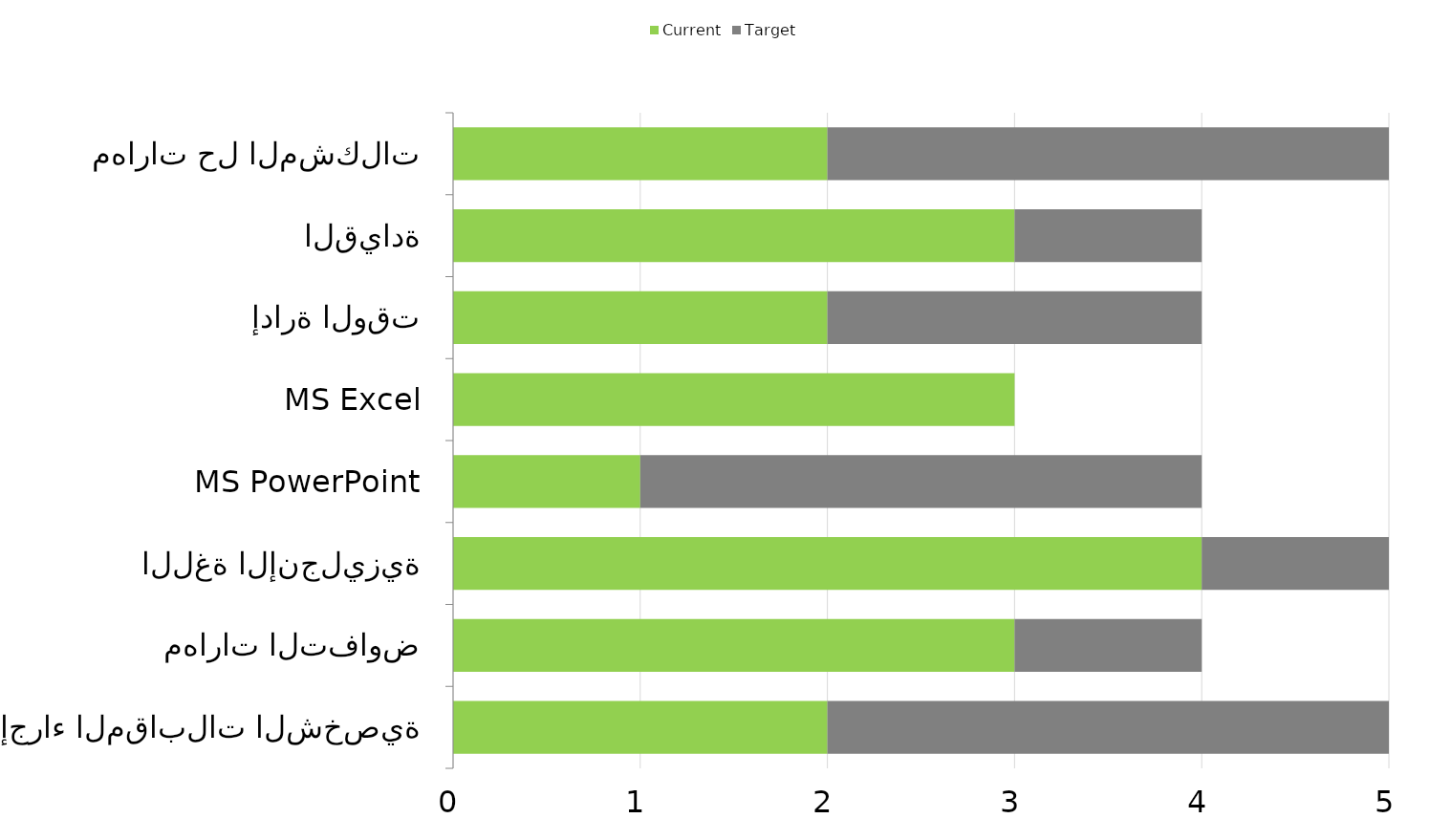
| Category | Current | Target |
|---|---|---|
| إجراء المقابلات الشخصية | 2 | 3 |
| مهارات التفاوض | 3 | 1 |
| اللغة الإنجليزية | 4 | 1 |
| MS PowerPoint | 1 | 3 |
| MS Excel | 3 | 0 |
| إدارة الوقت | 2 | 2 |
| القيادة | 3 | 1 |
| مهارات حل المشكلات | 2 | 3 |